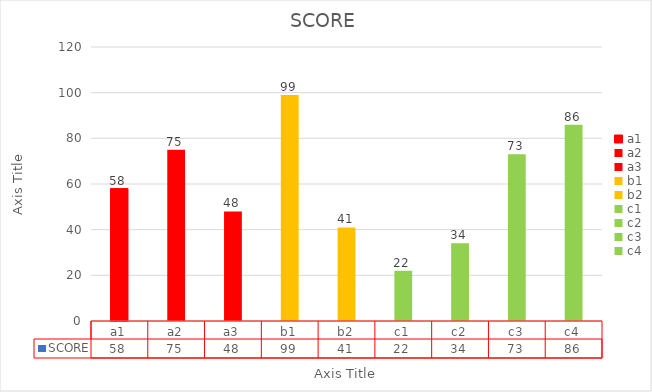
| Category | SCORE |
|---|---|
| a1 | 58 |
| a2 | 75 |
| a3 | 48 |
| b1 | 99 |
| b2 | 41 |
| c1 | 22 |
| c2 | 34 |
| c3 | 73 |
| c4 | 86 |